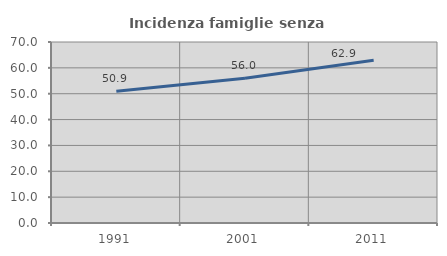
| Category | Incidenza famiglie senza nuclei |
|---|---|
| 1991.0 | 50.909 |
| 2001.0 | 56 |
| 2011.0 | 62.903 |